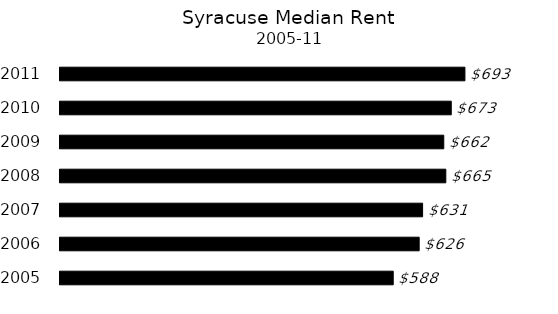
| Category | Series 0 |
|---|---|
| 2005 | 588 |
| 2006 | 626 |
| 2007 | 631 |
| 2008 | 665 |
| 2009 | 662 |
| 2010 | 673 |
| 2011 | 693 |